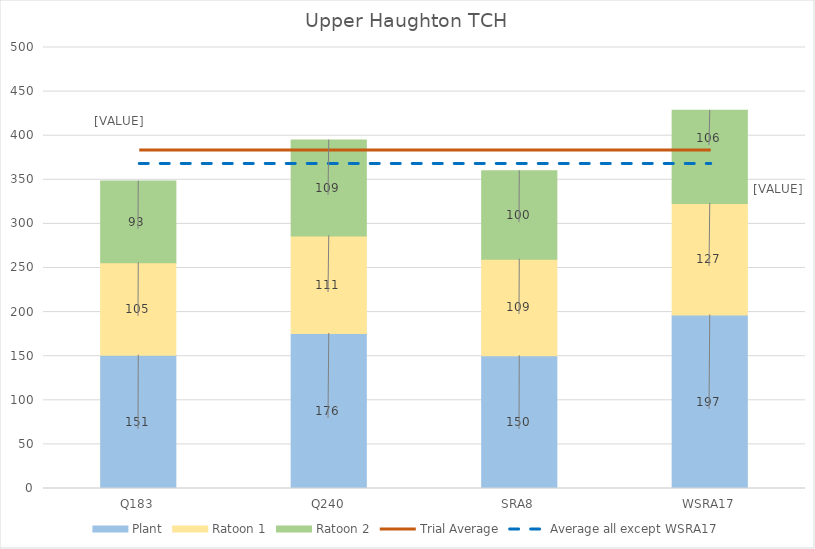
| Category | Plant | Ratoon 1 | Ratoon 2 |
|---|---|---|---|
| Q183 | 151.208 | 104.778 | 92.581 |
| Q240 | 175.739 | 110.683 | 108.626 |
| SRA8 | 150.475 | 109.497 | 100.184 |
| WSRA17 | 196.67 | 126.547 | 105.529 |